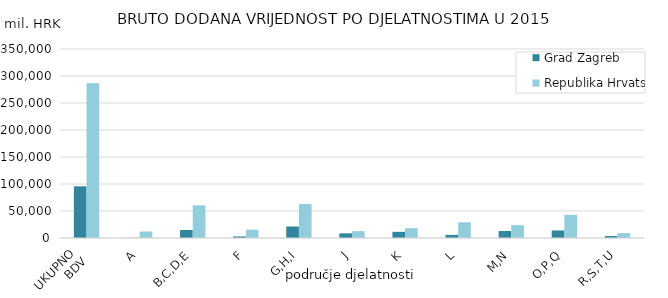
| Category | Grad Zagreb | Republika Hrvatska |
|---|---|---|
| UKUPNO 
BDV | 95670 | 286484 |
| A | 243 | 11944 |
| B,C,D,E | 14781 | 60423 |
| F | 2902 | 15310 |
| G,H,I | 21283 | 63184 |
| J | 8671 | 12740 |
| K | 11423 | 18219 |
| L | 5805 | 29087 |
| M,N | 12998 | 23720 |
| O,P,Q | 13924 | 42856 |
| R,S,T,U | 3639 | 8999 |